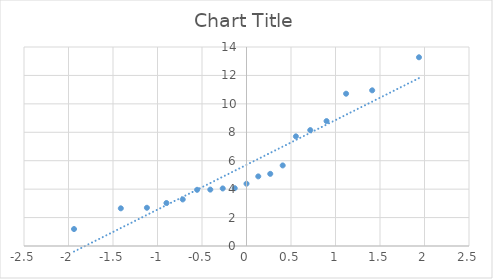
| Category | Series 0 |
|---|---|
| -1.9379315108528286 | 3 |
| -1.9379315108528286 | 3 |
| -1.9379315108528286 | 3 |
| -0.8994349076672336 | 5 |
| -0.7164975001779917 | 6 |
| -0.7164975001779917 | 6 |
| -0.40672425187136374 | 8 |
| -0.40672425187136374 | 8 |
| -0.13231285227617118 | 9 |
| -0.13231285227617118 | 9 |
| -0.13231285227617118 | 9 |
| 0.2669941254049526 | 10 |
| 0.40672425187136385 | 11 |
| 0.5549229427026539 | 12 |
| 0.5549229427026539 | 12 |
| 0.8994349076672336 | 13 |
| 0.8994349076672336 | 13 |
| 1.4121875789061642 | 14 |
| 1.9379315108528292 | 18 |